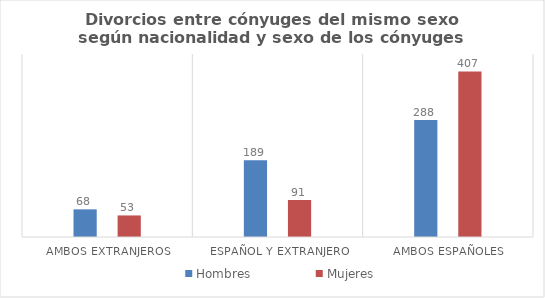
| Category | Hombres | Mujeres |
|---|---|---|
| Ambos extranjeros | 68 | 53 |
| Español y extranjero | 189 | 91 |
| Ambos españoles | 288 | 407 |